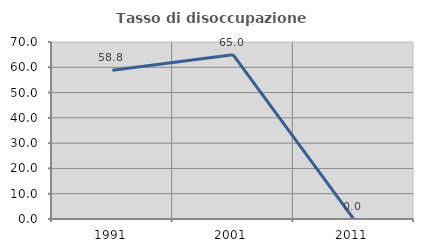
| Category | Tasso di disoccupazione giovanile  |
|---|---|
| 1991.0 | 58.824 |
| 2001.0 | 65 |
| 2011.0 | 0 |